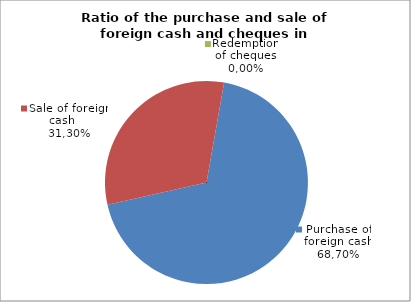
| Category | Purchase of foreign cash |
|---|---|
| 0 | 68.695 |
| 1 | 31.305 |
| 2 | 0 |